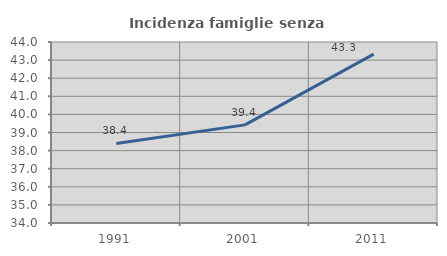
| Category | Incidenza famiglie senza nuclei |
|---|---|
| 1991.0 | 38.398 |
| 2001.0 | 39.421 |
| 2011.0 | 43.333 |